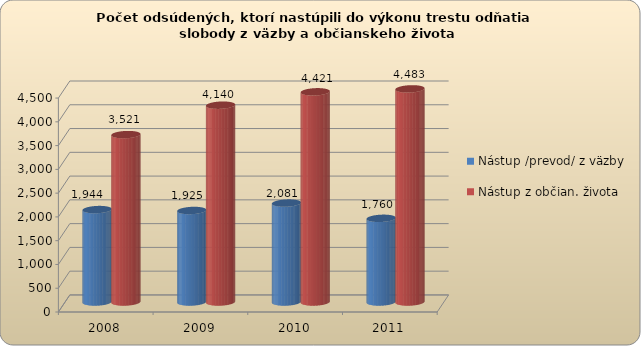
| Category | Nástup /prevod/ z väzby | Nástup z občian. života |
|---|---|---|
| 2008.0 | 1944 | 3521 |
| 2009.0 | 1925 | 4140 |
| 2010.0 | 2081 | 4421 |
| 2011.0 | 1760 | 4483 |